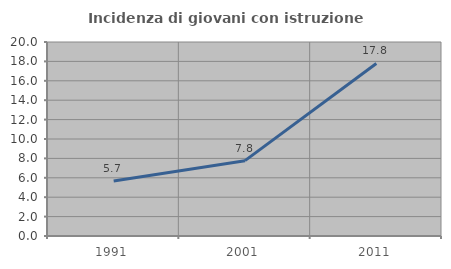
| Category | Incidenza di giovani con istruzione universitaria |
|---|---|
| 1991.0 | 5.664 |
| 2001.0 | 7.767 |
| 2011.0 | 17.788 |